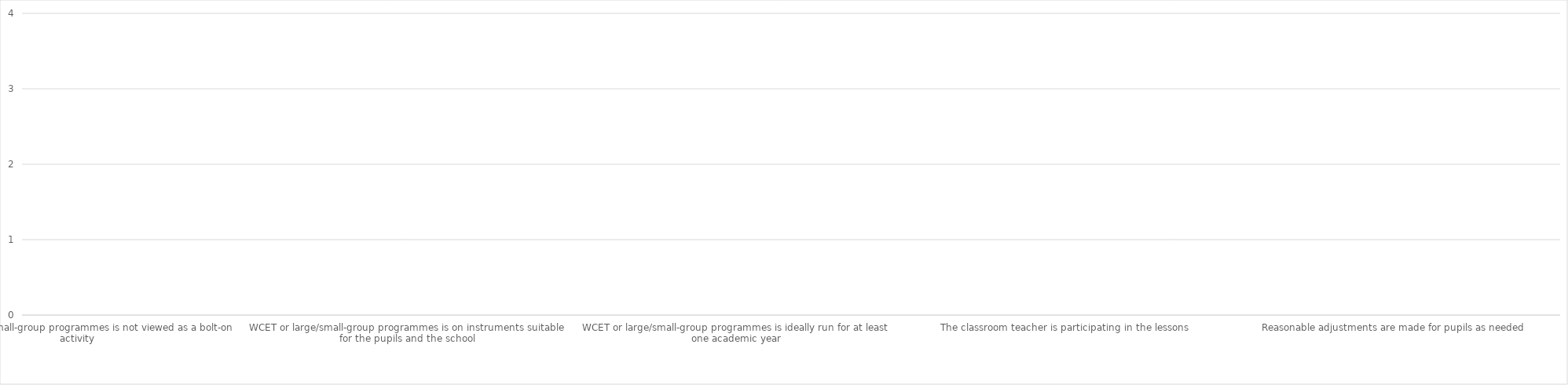
| Category | Series 0 |
|---|---|
| WCET or large/small-group programmes is not viewed as a bolt-on activity | 0 |
| WCET or large/small-group programmes is not external to the music curriculum, but is a key part of the school’s curricular music offer | 0 |
| WCET or large/small-group programmes is at an appropriate point within the music curriculum, most likely in Key Stage 2 | 0 |
| WCET or large/small-group programmes is on instruments suitable for the pupils and the school | 0 |
| Teachers and specialist tutors consider how pupils will use prior musical knowledge to support these instrumental lessons | 0 |
| School/trusts consider how they will access high-quality instruments and equipment to enable this provision, and work with the Music Hub to facilitate this where needed | 0 |
| WCET or large/small-group programmes is ideally run for at least one academic year | 0 |
| Music lead and class teacher work with the Hub to determine how and when this tuition would work best for their pupils | 0 |
| Music lead and class teacher work with the Hub to understand how each pupil has progressed through the programme | 0 |
| The classroom teacher is participating in the lessons | 0 |
| The classroom teacher is supporting the specialist teacher in enabling pupils to engage fully | 0 |
| Tuition is inclusive of all pupils | 0 |
| Reasonable adjustments are made for pupils as needed | 0 |
| The school and Hub has a clear and shared understanding of how pupils will be supported to take instrumental learning beyond the core WCET or large/small group teaching offer, and to progress on their chosen instrument, including support for those who migh | 0 |